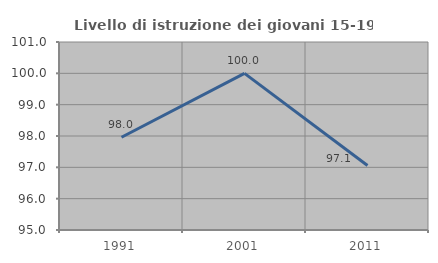
| Category | Livello di istruzione dei giovani 15-19 anni |
|---|---|
| 1991.0 | 97.959 |
| 2001.0 | 100 |
| 2011.0 | 97.059 |